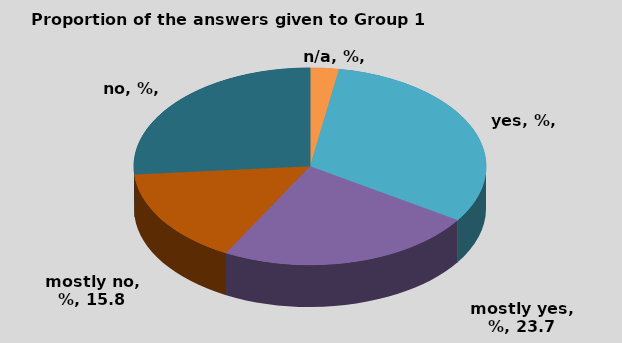
| Category | B1 |
|---|---|
| n/a, % | 2.632 |
| yes, % | 31.579 |
| mostly yes, % | 23.684 |
| mostly no, % | 15.789 |
| no, % | 26.316 |